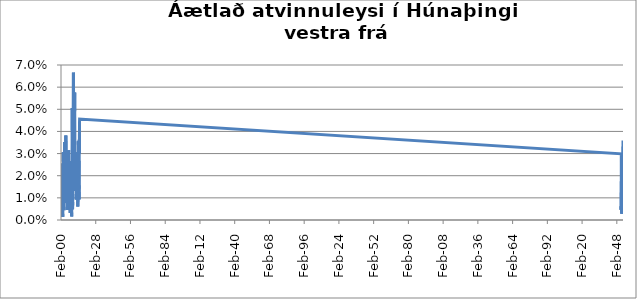
| Category | Series 0 |
|---|---|
| 2000-02-01 | 0.026 |
| 2000-03-01 | 0.024 |
| 2000-04-01 | 0.016 |
| 2000-05-01 | 0.006 |
| 2000-06-01 | 0.003 |
| 2000-07-01 | 0.001 |
| 2000-08-01 | 0.001 |
| 2000-09-01 | 0.004 |
| 2000-10-01 | 0.004 |
| 2000-11-01 | 0.006 |
| 2000-12-01 | 0.013 |
| 2001-01-01 | 0.013 |
| 2001-02-01 | 0.009 |
| 2001-03-01 | 0.013 |
| 2001-04-01 | 0.012 |
| 2001-05-01 | 0.006 |
| 2001-06-01 | 0.001 |
| 2001-07-01 | 0.001 |
| 2001-08-01 | 0.003 |
| 2001-09-01 | 0.003 |
| 2001-10-01 | 0.013 |
| 2001-11-01 | 0.017 |
| 2001-12-01 | 0.031 |
| 2002-01-01 | 0.026 |
| 2002-02-01 | 0.031 |
| 2002-03-01 | 0.023 |
| 2002-04-01 | 0.015 |
| 2002-05-01 | 0.012 |
| 2002-06-01 | 0.006 |
| 2002-07-01 | 0.004 |
| 2002-08-01 | 0.006 |
| 2002-09-01 | 0.012 |
| 2002-10-01 | 0.009 |
| 2002-11-01 | 0.019 |
| 2002-12-01 | 0.028 |
| 2003-01-01 | 0.032 |
| 2003-02-01 | 0.035 |
| 2003-03-01 | 0.025 |
| 2003-04-01 | 0.028 |
| 2003-05-01 | 0.021 |
| 2003-06-01 | 0.015 |
| 2003-07-01 | 0.016 |
| 2003-08-01 | 0.016 |
| 2003-09-01 | 0.019 |
| 2003-10-01 | 0.016 |
| 2003-11-01 | 0.027 |
| 2003-12-01 | 0.027 |
| 2004-01-01 | 0.038 |
| 2004-02-01 | 0.025 |
| 2004-03-01 | 0.024 |
| 2004-04-01 | 0.02 |
| 2004-05-01 | 0.02 |
| 2004-06-01 | 0.009 |
| 2004-07-01 | 0.008 |
| 2004-08-01 | 0.009 |
| 2004-09-01 | 0.008 |
| 2004-10-01 | 0.013 |
| 2004-11-01 | 0.025 |
| 2004-12-01 | 0.022 |
| 2005-01-01 | 0.025 |
| 2005-02-01 | 0.022 |
| 2005-03-01 | 0.022 |
| 2005-04-01 | 0.02 |
| 2005-05-01 | 0.008 |
| 2005-06-01 | 0.006 |
| 2005-07-01 | 0.005 |
| 2005-08-01 | 0.008 |
| 2005-09-01 | 0.005 |
| 2005-10-01 | 0.014 |
| 2005-11-01 | 0.024 |
| 2005-12-01 | 0.027 |
| 2006-01-01 | 0.024 |
| 2006-02-01 | 0.024 |
| 2006-03-01 | 0.028 |
| 2006-04-01 | 0.031 |
| 2006-05-01 | 0.012 |
| 2006-06-01 | 0.007 |
| 2006-07-01 | 0.006 |
| 2006-08-01 | 0.006 |
| 2006-09-01 | 0.006 |
| 2006-10-01 | 0.009 |
| 2006-11-01 | 0.012 |
| 2006-12-01 | 0.016 |
| 2007-01-01 | 0.027 |
| 2007-02-01 | 0.027 |
| 2007-03-01 | 0.02 |
| 2007-04-01 | 0.012 |
| 2007-05-01 | 0.008 |
| 2007-06-01 | 0.005 |
| 2007-07-01 | 0.005 |
| 2007-08-01 | 0.003 |
| 2007-09-01 | 0.006 |
| 2007-10-01 | 0.007 |
| 2007-11-01 | 0.007 |
| 2007-12-01 | 0.007 |
| 2008-01-01 | 0.008 |
| 2008-02-01 | 0.011 |
| 2008-03-01 | 0.015 |
| 2008-04-01 | 0.014 |
| 2008-05-01 | 0.012 |
| 2008-06-01 | 0.006 |
| 2008-07-01 | 0.006 |
| 2008-08-01 | 0.003 |
| 2008-09-01 | 0.002 |
| 2008-10-01 | 0.003 |
| 2008-11-01 | 0.013 |
| 2008-12-01 | 0.017 |
| 2009-01-01 | 0.03 |
| 2009-02-01 | 0.037 |
| 2009-03-01 | 0.051 |
| 2009-04-01 | 0.041 |
| 2009-05-01 | 0.031 |
| 2009-06-01 | 0.005 |
| 2009-07-01 | 0.008 |
| 2009-08-01 | 0.008 |
| 2009-09-01 | 0.015 |
| 2009-10-01 | 0.025 |
| 2009-11-01 | 0.042 |
| 2009-12-01 | 0.047 |
| 2010-01-01 | 0.061 |
| 2010-02-01 | 0.067 |
| 2010-03-01 | 0.061 |
| 2010-04-01 | 0.049 |
| 2010-05-01 | 0.031 |
| 2010-06-01 | 0.016 |
| 2010-07-01 | 0.02 |
| 2010-08-01 | 0.018 |
| 2010-09-01 | 0.013 |
| 2010-10-01 | 0.028 |
| 2010-11-01 | 0.038 |
| 2010-12-01 | 0.043 |
| 2011-01-01 | 0.054 |
| 2011-02-01 | 0.058 |
| 2011-03-01 | 0.049 |
| 2011-04-01 | 0.041 |
| 2011-05-01 | 0.021 |
| 2011-06-01 | 0.021 |
| 2011-07-01 | 0.019 |
| 2011-08-01 | 0.014 |
| 2011-09-01 | 0.014 |
| 2011-10-01 | 0.018 |
| 2011-11-01 | 0.025 |
| 2011-12-01 | 0.028 |
| 2012-01-01 | 0.026 |
| 2012-02-01 | 0.027 |
| 2012-03-01 | 0.021 |
| 2012-04-01 | 0.018 |
| 2012-05-01 | 0.017 |
| 2012-06-01 | 0.009 |
| 2012-07-01 | 0.012 |
| 2012-08-01 | 0.014 |
| 2012-09-01 | 0.016 |
| 2012-10-01 | 0.023 |
| 2012-11-01 | 0.031 |
| 2012-12-01 | 0.031 |
| 2013-01-01 | 0.027 |
| 2013-02-01 | 0.026 |
| 2013-03-01 | 0.013 |
| 2013-04-01 | 0.012 |
| 2013-05-01 | 0.012 |
| 2013-06-01 | 0.012 |
| 2013-07-01 | 0.012 |
| 2013-08-01 | 0.011 |
| 2013-09-01 | 0.006 |
| 2013-10-01 | 0.014 |
| 2013-11-01 | 0.019 |
| 2013-12-01 | 0.027 |
| 2014-01-01 | 0.036 |
| 2014-02-01 | 0.034 |
| 2014-03-01 | 0.031 |
| 2014-04-01 | 0.025 |
| 2014-05-01 | 0.014 |
| 2014-06-01 | 0.016 |
| 2014-07-01 | 0.016 |
| 2014-08-01 | 0.009 |
| 2014-09-01 | 0.009 |
| 2014-10-01 | 0.027 |
| 2014-11-01 | 0.036 |
| 2014-12-01 | 0.03 |
| 2015-01-01 | 0.044 |
| 2015-02-01 | 0.046 |
| 201503.0 | 0.03 |
| 201504.0 | 0.026 |
| 201505.0 | 0.012 |
| 201506.0 | 0.008 |
| 201507.0 | 0.008 |
| 201508.0 | 0.005 |
| 201509.0 | 0.006 |
| 201510.0 | 0.005 |
| 201511.0 | 0.012 |
| 201512.0 | 0.017 |
| 201601.0 | 0.02 |
| 201602.0 | 0.022 |
| 201603.0 | 0.023 |
| 201604.0 | 0.02 |
| 201605.0 | 0.012 |
| 201606.0 | 0.011 |
| 201607.0 | 0.006 |
| 201608.0 | 0.003 |
| 201609.0 | 0.006 |
| 201610.0 | 0.012 |
| 201611.0 | 0.013 |
| 201612.0 | 0.015 |
| 201701.0 | 0.016 |
| 201702.0 | 0.015 |
| 201703.0 | 0.01 |
| 201704.0 | 0.01 |
| 201705.0 | 0.009 |
| 201706.0 | 0.003 |
| 201707.0 | 0.004 |
| 201708.0 | 0.006 |
| 201709.0 | 0.007 |
| 201710.0 | 0.013 |
| 201711.0 | 0.016 |
| 201712.0 | 0.018 |
| 201801.0 | 0.024 |
| 201802.0 | 0.021 |
| 201803.0 | 0.016 |
| 201804.0 | 0.013 |
| 201805.0 | 0.012 |
| 201806.0 | 0.007 |
| 201807.0 | 0.009 |
| 201808.0 | 0.011 |
| 201809.0 | 0.012 |
| 201810.0 | 0.012 |
| 201811.0 | 0.021 |
| 201812.0 | 0.024 |
| 201901.0 | 0.025 |
| 201902.0 | 0.022 |
| 201903.0 | 0.021 |
| 201904.0 | 0.016 |
| 201905.0 | 0.013 |
| 201906.0 | 0.013 |
| 201907.0 | 0.018 |
| 201908.0 | 0.02 |
| 201909.0 | 0.017 |
| 201910.0 | 0.026 |
| 201911.0 | 0.023 |
| 201912.0 | 0.029 |
| 202001.0 | 0.036 |
| 202002.0 | 0.036 |